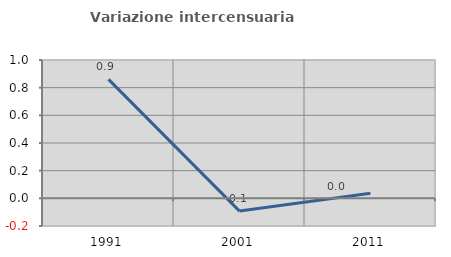
| Category | Variazione intercensuaria annua |
|---|---|
| 1991.0 | 0.86 |
| 2001.0 | -0.092 |
| 2011.0 | 0.037 |